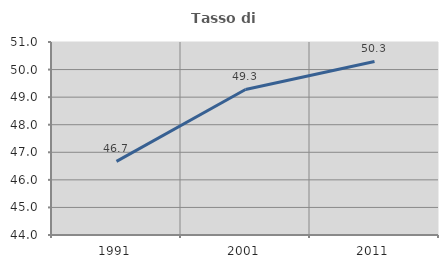
| Category | Tasso di occupazione   |
|---|---|
| 1991.0 | 46.67 |
| 2001.0 | 49.277 |
| 2011.0 | 50.296 |